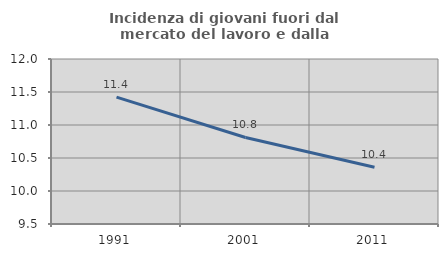
| Category | Incidenza di giovani fuori dal mercato del lavoro e dalla formazione  |
|---|---|
| 1991.0 | 11.422 |
| 2001.0 | 10.811 |
| 2011.0 | 10.36 |